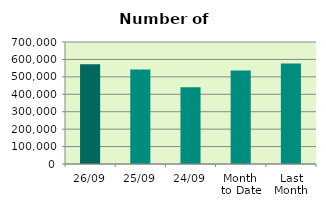
| Category | Series 0 |
|---|---|
| 26/09 | 571814 |
| 25/09 | 542760 |
| 24/09 | 439766 |
| Month 
to Date | 536746.421 |
| Last
Month | 576518.909 |